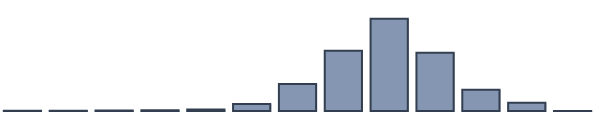
| Category | Series 0 |
|---|---|
| 0 | 0.087 |
| 1 | 0.087 |
| 2 | 0.174 |
| 3 | 0.261 |
| 4 | 0.522 |
| 5 | 2.565 |
| 6 | 9.739 |
| 7 | 21.696 |
| 8 | 33.217 |
| 9 | 20.957 |
| 10 | 7.696 |
| 11 | 2.957 |
| 12 | 0.043 |